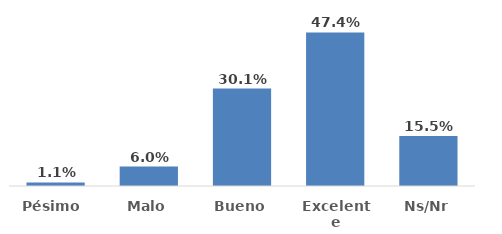
| Category | Series 0 |
|---|---|
| Pésimo  | 0.011 |
| Malo | 0.06 |
| Bueno | 0.301 |
| Excelente | 0.474 |
| Ns/Nr | 0.155 |